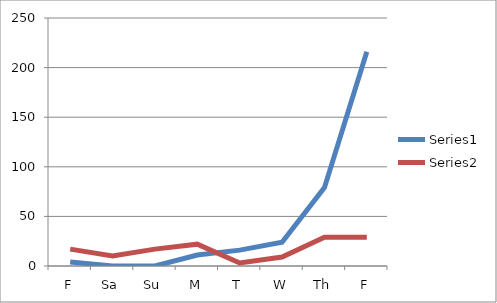
| Category | Series 0 | Series 1 |
|---|---|---|
| F | 4 | 17 |
| Sa | 0 | 10 |
| Su | 0 | 17 |
| M | 11 | 22 |
| T | 16 | 3 |
| W | 24 | 9 |
| Th | 79 | 29 |
| F | 216 | 29 |